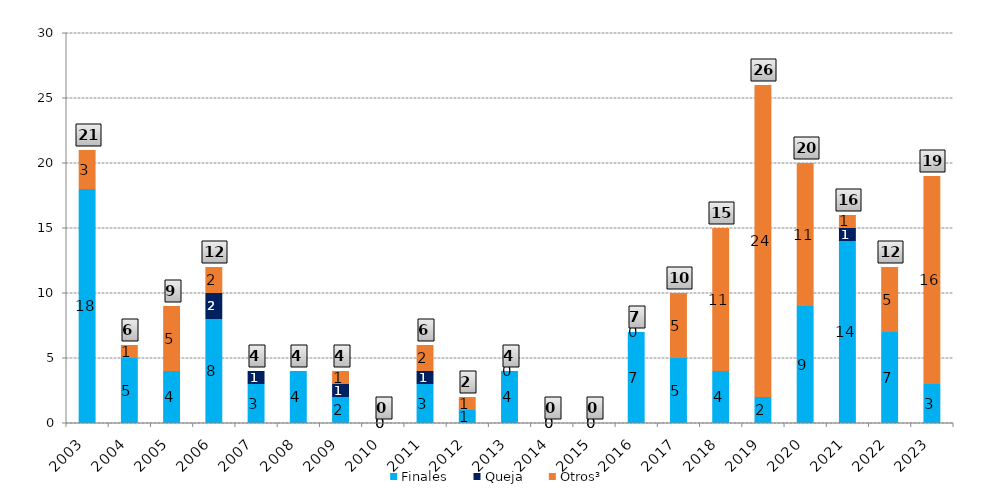
| Category | Finales | Queja | Otros³ |
|---|---|---|---|
| 0 | 18 | 0 | 3 |
| 1 | 5 | 0 | 1 |
| 2 | 4 | 0 | 5 |
| 3 | 8 | 2 | 2 |
| 4 | 3 | 1 | 0 |
| 5 | 4 | 0 | 0 |
| 6 | 2 | 1 | 1 |
| 7 | 0 | 0 | 0 |
| 8 | 3 | 1 | 2 |
| 9 | 1 | 0 | 1 |
| 10 | 4 | 0 | 0 |
| 11 | 0 | 0 | 0 |
| 12 | 0 | 0 | 0 |
| 13 | 7 | 0 | 0 |
| 14 | 5 | 0 | 5 |
| 15 | 4 | 0 | 11 |
| 16 | 2 | 0 | 24 |
| 17 | 9 | 0 | 11 |
| 18 | 14 | 1 | 1 |
| 19 | 7 | 0 | 5 |
| 20 | 3 | 0 | 16 |